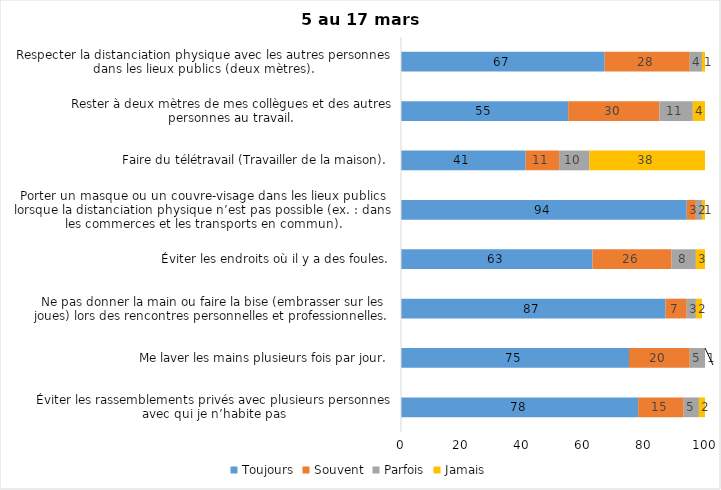
| Category | Toujours | Souvent | Parfois | Jamais |
|---|---|---|---|---|
| Éviter les rassemblements privés avec plusieurs personnes avec qui je n’habite pas | 78 | 15 | 5 | 2 |
| Me laver les mains plusieurs fois par jour. | 75 | 20 | 5 | 1 |
| Ne pas donner la main ou faire la bise (embrasser sur les joues) lors des rencontres personnelles et professionnelles. | 87 | 7 | 3 | 2 |
| Éviter les endroits où il y a des foules. | 63 | 26 | 8 | 3 |
| Porter un masque ou un couvre-visage dans les lieux publics lorsque la distanciation physique n’est pas possible (ex. : dans les commerces et les transports en commun). | 94 | 3 | 2 | 1 |
| Faire du télétravail (Travailler de la maison). | 41 | 11 | 10 | 38 |
| Rester à deux mètres de mes collègues et des autres personnes au travail. | 55 | 30 | 11 | 4 |
| Respecter la distanciation physique avec les autres personnes dans les lieux publics (deux mètres). | 67 | 28 | 4 | 1 |